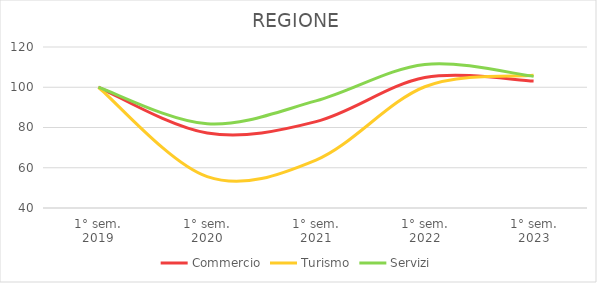
| Category | Commercio | Turismo | Servizi |
|---|---|---|---|
| 1° sem.
2019 | 100 | 100 | 100 |
| 1° sem.
2020 | 77.265 | 55.561 | 81.869 |
| 1° sem.
2021 | 82.921 | 63.834 | 93.205 |
| 1° sem.
2022 | 104.817 | 100.239 | 111.304 |
| 1° sem.
2023 | 103.049 | 105.95 | 105.404 |